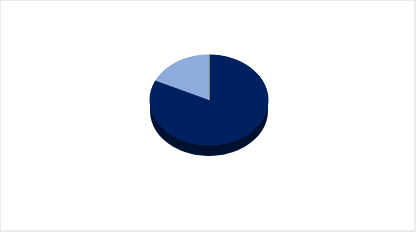
| Category | Series 0 |
|---|---|
| PRESUPUESTO VIGENTE PARA 2023 | 26648782 |
| PRESUPUESTO EJECUTADO  | 5826929.59 |
| PORCENTAJE DE EJECUCIÓN  | 0.219 |